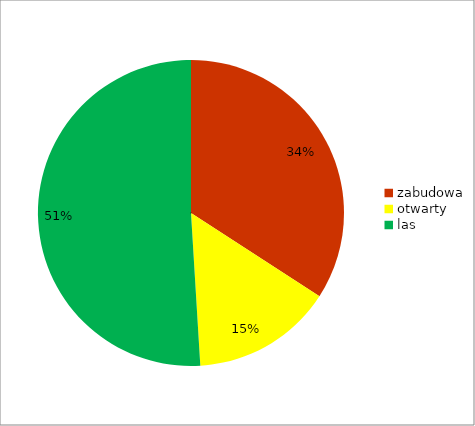
| Category | Series 0 |
|---|---|
| zabudowa | 0.341 |
| otwarty | 0.149 |
| las | 0.51 |